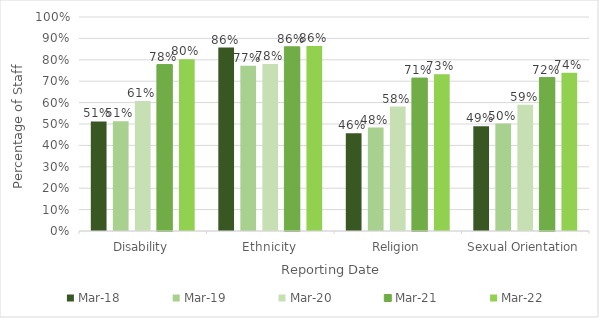
| Category | Mar-18 | Mar-19 | Mar-20 | Mar-21 | Mar-22 |
|---|---|---|---|---|---|
| Disability | 0.512 | 0.513 | 0.607 | 0.778 | 0.802 |
| Ethnicity | 0.857 | 0.772 | 0.781 | 0.861 | 0.864 |
| Religion | 0.457 | 0.483 | 0.581 | 0.715 | 0.732 |
| Sexual Orientation | 0.49 | 0.502 | 0.59 | 0.717 | 0.74 |